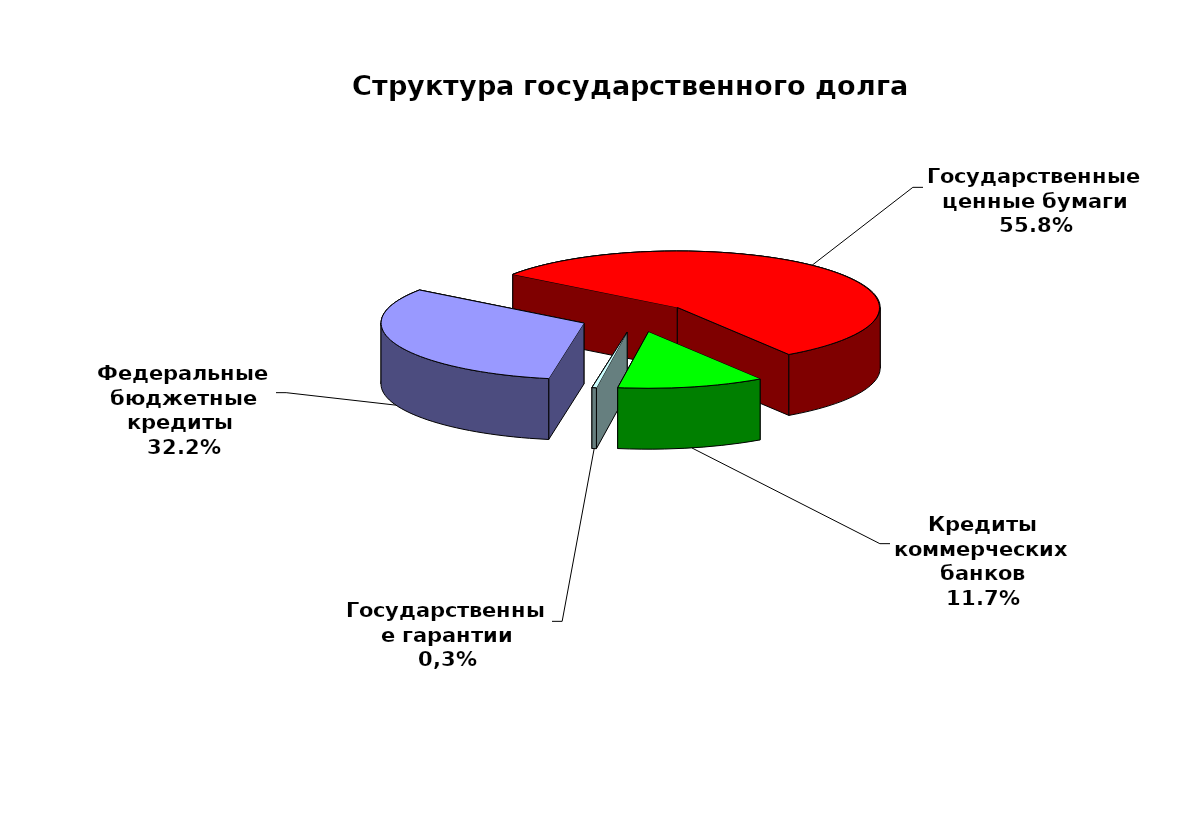
| Category | Series 0 |
|---|---|
| Федеральные бюджетные кредиты  | 20959084.963 |
| Государственные ценные бумаги | 36300000 |
| Кредиты коммерческих банков | 7612182 |
| Государственные гарантии | 232477.01 |